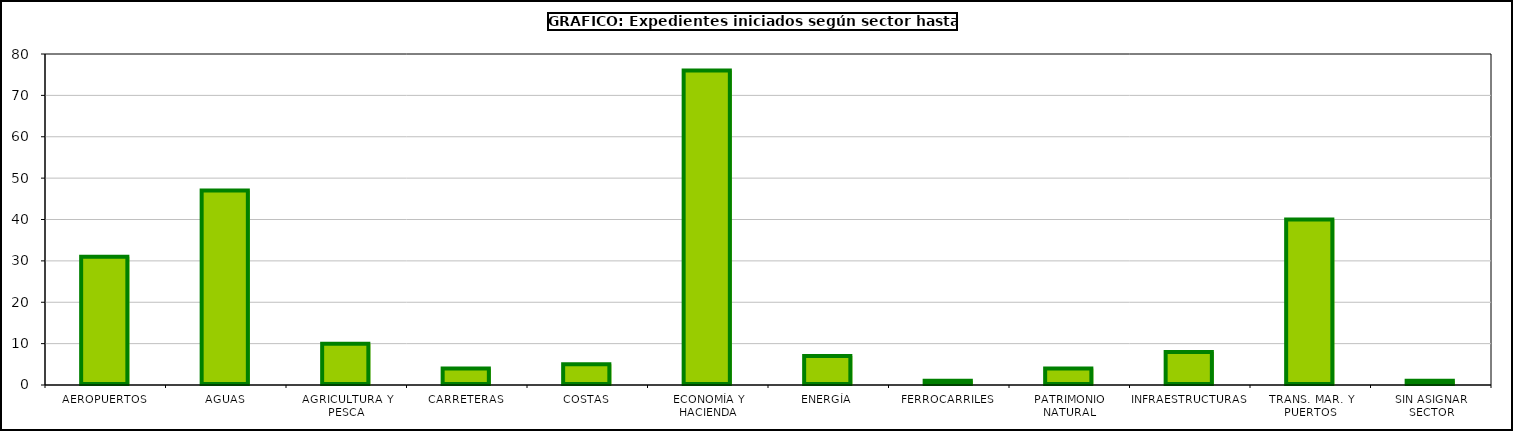
| Category | Series 0 |
|---|---|
| AEROPUERTOS | 31 |
| AGUAS | 47 |
| AGRICULTURA Y PESCA | 10 |
| CARRETERAS | 4 |
| COSTAS | 5 |
| ECONOMÍA Y HACIENDA | 76 |
| ENERGÍA | 7 |
| FERROCARRILES | 1 |
| PATRIMONIO NATURAL | 4 |
| INFRAESTRUCTURAS | 8 |
| TRANS. MAR. Y PUERTOS | 40 |
| SIN ASIGNAR SECTOR | 1 |